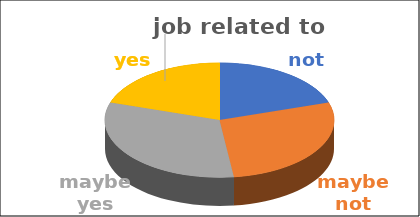
| Category | job related to studies | Series 1 | Series 2 | Series 3 | Series 4 |
|---|---|---|---|---|---|
| not | 0.2 |  |  |  |  |
| maybe not | 0.28 |  |  |  |  |
| maybe yes | 0.32 |  |  |  |  |
| yes | 0.2 |  |  |  |  |